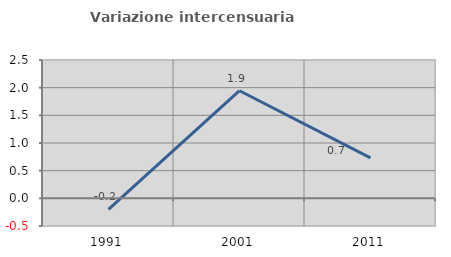
| Category | Variazione intercensuaria annua |
|---|---|
| 1991.0 | -0.199 |
| 2001.0 | 1.945 |
| 2011.0 | 0.732 |